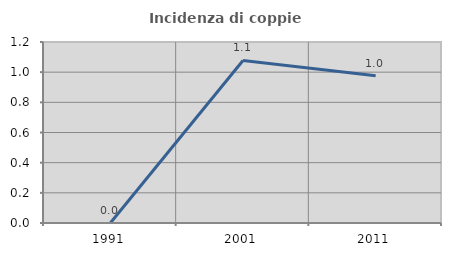
| Category | Incidenza di coppie miste |
|---|---|
| 1991.0 | 0 |
| 2001.0 | 1.078 |
| 2011.0 | 0.976 |